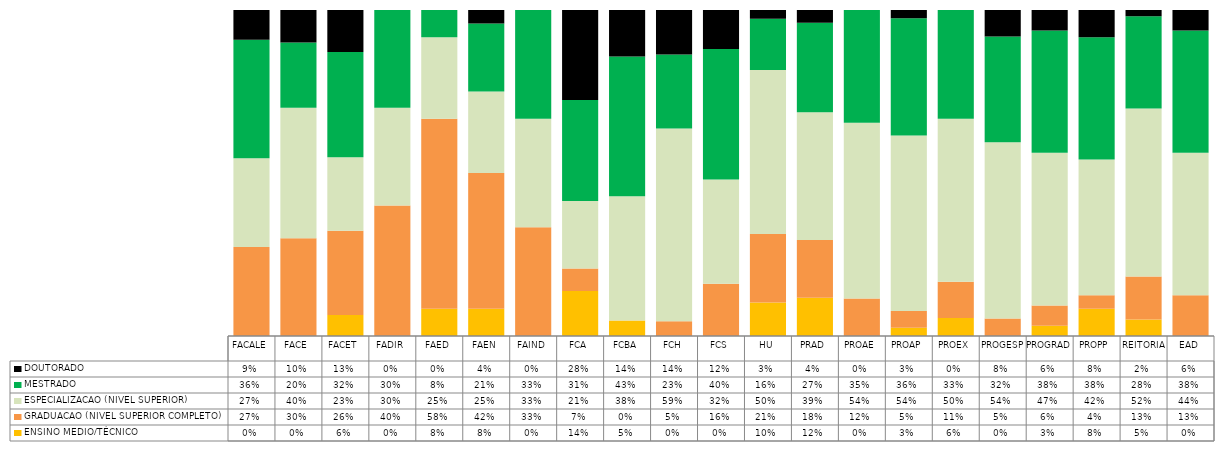
| Category | ENSINO MEDIO/TÉCNICO | GRADUACAO (NIVEL SUPERIOR COMPLETO) | ESPECIALIZACAO (NIVEL SUPERIOR) | MESTRADO | DOUTORADO |
|---|---|---|---|---|---|
| FACALE | 0 | 0.273 | 0.273 | 0.364 | 0.091 |
| FACE | 0 | 0.3 | 0.4 | 0.2 | 0.1 |
| FACET | 0.065 | 0.258 | 0.226 | 0.323 | 0.129 |
| FADIR | 0 | 0.4 | 0.3 | 0.3 | 0 |
| FAED | 0.083 | 0.583 | 0.25 | 0.083 | 0 |
| FAEN | 0.083 | 0.417 | 0.25 | 0.208 | 0.042 |
| FAIND | 0 | 0.333 | 0.333 | 0.333 | 0 |
| FCA | 0.138 | 0.069 | 0.207 | 0.31 | 0.276 |
| FCBA | 0.048 | 0 | 0.381 | 0.429 | 0.143 |
| FCH | 0 | 0.045 | 0.591 | 0.227 | 0.136 |
| FCS | 0 | 0.16 | 0.32 | 0.4 | 0.12 |
| HU | 0.102 | 0.211 | 0.503 | 0.157 | 0.027 |
| PRAD | 0.118 | 0.176 | 0.392 | 0.275 | 0.039 |
| PROAE | 0 | 0.115 | 0.538 | 0.346 | 0 |
| PROAP | 0.026 | 0.051 | 0.538 | 0.359 | 0.026 |
| PROEX | 0.056 | 0.111 | 0.5 | 0.333 | 0 |
| PROGESP | 0 | 0.054 | 0.541 | 0.324 | 0.081 |
| PROGRAD | 0.031 | 0.062 | 0.469 | 0.375 | 0.062 |
| PROPP | 0.083 | 0.042 | 0.417 | 0.375 | 0.083 |
| REITORIA | 0.05 | 0.132 | 0.516 | 0.283 | 0.019 |
| EAD | 0 | 0.125 | 0.438 | 0.375 | 0.062 |